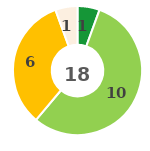
| Category | Series 0 |
|---|---|
| 0 | 1 |
| 1 | 10 |
| 2 | 6 |
| 3 | 0 |
| 4 | 1 |